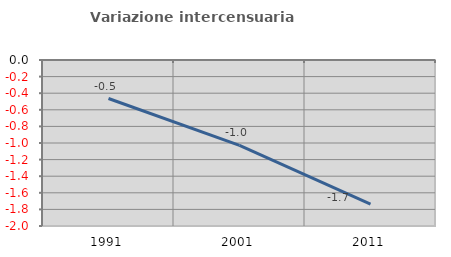
| Category | Variazione intercensuaria annua |
|---|---|
| 1991.0 | -0.464 |
| 2001.0 | -1.029 |
| 2011.0 | -1.736 |